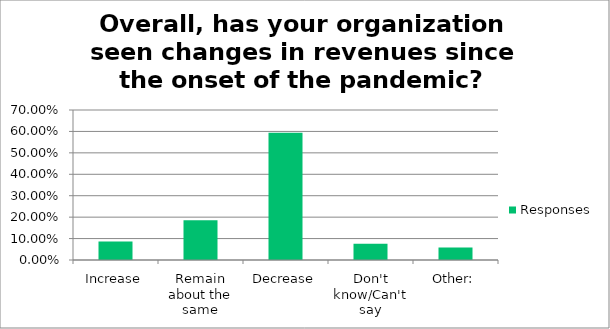
| Category | Responses |
|---|---|
| Increase | 0.087 |
| Remain about the same | 0.185 |
| Decrease | 0.594 |
| Don't know/Can't say | 0.076 |
| Other: | 0.058 |